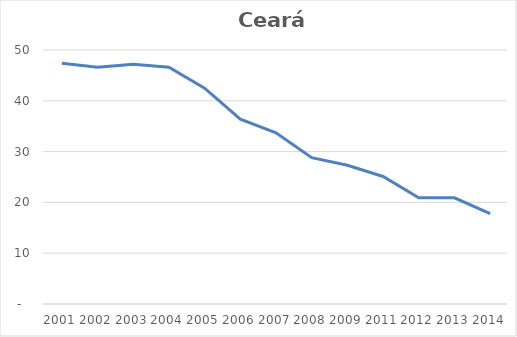
| Category | Total |
|---|---|
| 2001.0 | 47.4 |
| 2002.0 | 46.6 |
| 2003.0 | 47.2 |
| 2004.0 | 46.6 |
| 2005.0 | 42.5 |
| 2006.0 | 36.4 |
| 2007.0 | 33.7 |
| 2008.0 | 28.8 |
| 2009.0 | 27.3 |
| 2011.0 | 25.1 |
| 2012.0 | 20.9 |
| 2013.0 | 20.9 |
| 2014.0 | 17.8 |